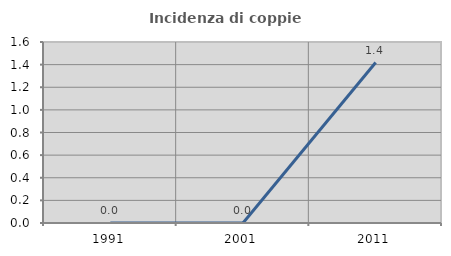
| Category | Incidenza di coppie miste |
|---|---|
| 1991.0 | 0 |
| 2001.0 | 0 |
| 2011.0 | 1.418 |